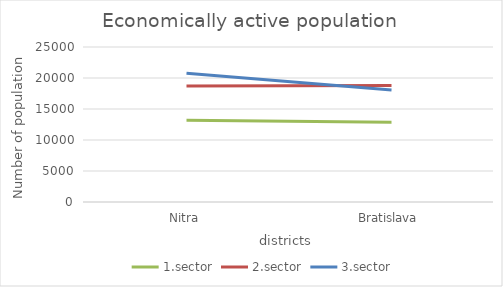
| Category | 1.sector | 2.sector | 3.sector |
|---|---|---|---|
| Nitra | 13204 | 18702 | 20760 |
| Bratislava | 12865 | 18803 | 18076 |